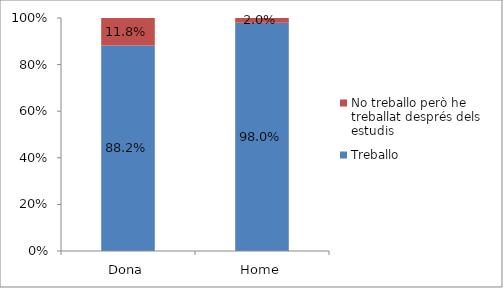
| Category | Treballo | No treballo però he treballat després dels estudis |
|---|---|---|
| Dona | 0.882 | 0.118 |
| Home | 0.98 | 0.02 |